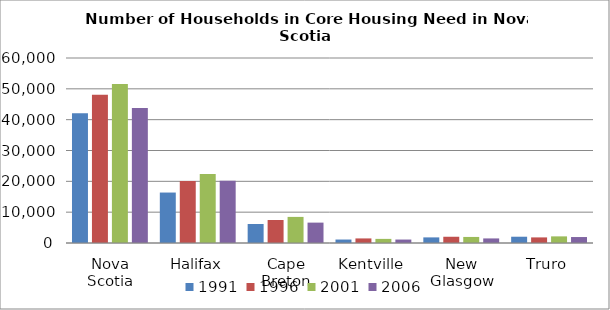
| Category | 1991 | 1996 | 2001 | 2006 |
|---|---|---|---|---|
| Nova Scotia | 42070 | 48105 | 51590 | 43760 |
| Halifax | 16365 | 20100 | 22390 | 20200 |
| Cape Breton | 6170 | 7455 | 8465 | 6610 |
| Kentville | 1125 | 1485 | 1335 | 1120 |
| New Glasgow | 1820 | 2025 | 1965 | 1485 |
| Truro | 2035 | 1815 | 2150 | 1935 |